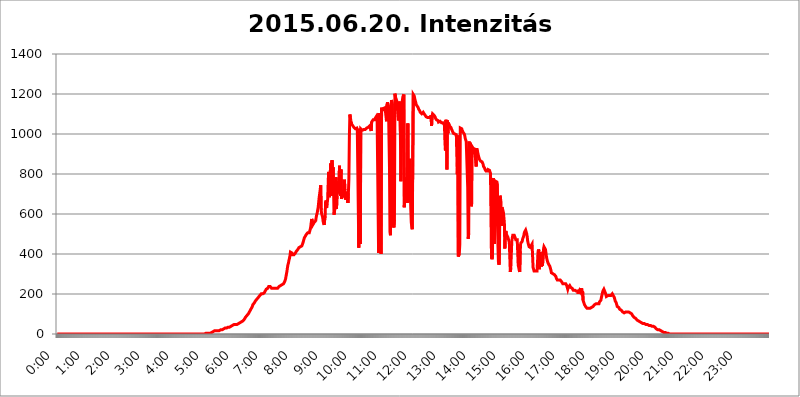
| Category | 2015.06.20. Intenzitás [W/m^2] |
|---|---|
| 0.0 | 0 |
| 0.0006944444444444445 | 0 |
| 0.001388888888888889 | 0 |
| 0.0020833333333333333 | 0 |
| 0.002777777777777778 | 0 |
| 0.003472222222222222 | 0 |
| 0.004166666666666667 | 0 |
| 0.004861111111111111 | 0 |
| 0.005555555555555556 | 0 |
| 0.0062499999999999995 | 0 |
| 0.006944444444444444 | 0 |
| 0.007638888888888889 | 0 |
| 0.008333333333333333 | 0 |
| 0.009027777777777779 | 0 |
| 0.009722222222222222 | 0 |
| 0.010416666666666666 | 0 |
| 0.011111111111111112 | 0 |
| 0.011805555555555555 | 0 |
| 0.012499999999999999 | 0 |
| 0.013194444444444444 | 0 |
| 0.013888888888888888 | 0 |
| 0.014583333333333332 | 0 |
| 0.015277777777777777 | 0 |
| 0.015972222222222224 | 0 |
| 0.016666666666666666 | 0 |
| 0.017361111111111112 | 0 |
| 0.018055555555555557 | 0 |
| 0.01875 | 0 |
| 0.019444444444444445 | 0 |
| 0.02013888888888889 | 0 |
| 0.020833333333333332 | 0 |
| 0.02152777777777778 | 0 |
| 0.022222222222222223 | 0 |
| 0.02291666666666667 | 0 |
| 0.02361111111111111 | 0 |
| 0.024305555555555556 | 0 |
| 0.024999999999999998 | 0 |
| 0.025694444444444447 | 0 |
| 0.02638888888888889 | 0 |
| 0.027083333333333334 | 0 |
| 0.027777777777777776 | 0 |
| 0.02847222222222222 | 0 |
| 0.029166666666666664 | 0 |
| 0.029861111111111113 | 0 |
| 0.030555555555555555 | 0 |
| 0.03125 | 0 |
| 0.03194444444444445 | 0 |
| 0.03263888888888889 | 0 |
| 0.03333333333333333 | 0 |
| 0.034027777777777775 | 0 |
| 0.034722222222222224 | 0 |
| 0.035416666666666666 | 0 |
| 0.036111111111111115 | 0 |
| 0.03680555555555556 | 0 |
| 0.0375 | 0 |
| 0.03819444444444444 | 0 |
| 0.03888888888888889 | 0 |
| 0.03958333333333333 | 0 |
| 0.04027777777777778 | 0 |
| 0.04097222222222222 | 0 |
| 0.041666666666666664 | 0 |
| 0.042361111111111106 | 0 |
| 0.04305555555555556 | 0 |
| 0.043750000000000004 | 0 |
| 0.044444444444444446 | 0 |
| 0.04513888888888889 | 0 |
| 0.04583333333333334 | 0 |
| 0.04652777777777778 | 0 |
| 0.04722222222222222 | 0 |
| 0.04791666666666666 | 0 |
| 0.04861111111111111 | 0 |
| 0.049305555555555554 | 0 |
| 0.049999999999999996 | 0 |
| 0.05069444444444445 | 0 |
| 0.051388888888888894 | 0 |
| 0.052083333333333336 | 0 |
| 0.05277777777777778 | 0 |
| 0.05347222222222222 | 0 |
| 0.05416666666666667 | 0 |
| 0.05486111111111111 | 0 |
| 0.05555555555555555 | 0 |
| 0.05625 | 0 |
| 0.05694444444444444 | 0 |
| 0.057638888888888885 | 0 |
| 0.05833333333333333 | 0 |
| 0.05902777777777778 | 0 |
| 0.059722222222222225 | 0 |
| 0.06041666666666667 | 0 |
| 0.061111111111111116 | 0 |
| 0.06180555555555556 | 0 |
| 0.0625 | 0 |
| 0.06319444444444444 | 0 |
| 0.06388888888888888 | 0 |
| 0.06458333333333334 | 0 |
| 0.06527777777777778 | 0 |
| 0.06597222222222222 | 0 |
| 0.06666666666666667 | 0 |
| 0.06736111111111111 | 0 |
| 0.06805555555555555 | 0 |
| 0.06874999999999999 | 0 |
| 0.06944444444444443 | 0 |
| 0.07013888888888889 | 0 |
| 0.07083333333333333 | 0 |
| 0.07152777777777779 | 0 |
| 0.07222222222222223 | 0 |
| 0.07291666666666667 | 0 |
| 0.07361111111111111 | 0 |
| 0.07430555555555556 | 0 |
| 0.075 | 0 |
| 0.07569444444444444 | 0 |
| 0.0763888888888889 | 0 |
| 0.07708333333333334 | 0 |
| 0.07777777777777778 | 0 |
| 0.07847222222222222 | 0 |
| 0.07916666666666666 | 0 |
| 0.0798611111111111 | 0 |
| 0.08055555555555556 | 0 |
| 0.08125 | 0 |
| 0.08194444444444444 | 0 |
| 0.08263888888888889 | 0 |
| 0.08333333333333333 | 0 |
| 0.08402777777777777 | 0 |
| 0.08472222222222221 | 0 |
| 0.08541666666666665 | 0 |
| 0.08611111111111112 | 0 |
| 0.08680555555555557 | 0 |
| 0.08750000000000001 | 0 |
| 0.08819444444444445 | 0 |
| 0.08888888888888889 | 0 |
| 0.08958333333333333 | 0 |
| 0.09027777777777778 | 0 |
| 0.09097222222222222 | 0 |
| 0.09166666666666667 | 0 |
| 0.09236111111111112 | 0 |
| 0.09305555555555556 | 0 |
| 0.09375 | 0 |
| 0.09444444444444444 | 0 |
| 0.09513888888888888 | 0 |
| 0.09583333333333333 | 0 |
| 0.09652777777777777 | 0 |
| 0.09722222222222222 | 0 |
| 0.09791666666666667 | 0 |
| 0.09861111111111111 | 0 |
| 0.09930555555555555 | 0 |
| 0.09999999999999999 | 0 |
| 0.10069444444444443 | 0 |
| 0.1013888888888889 | 0 |
| 0.10208333333333335 | 0 |
| 0.10277777777777779 | 0 |
| 0.10347222222222223 | 0 |
| 0.10416666666666667 | 0 |
| 0.10486111111111111 | 0 |
| 0.10555555555555556 | 0 |
| 0.10625 | 0 |
| 0.10694444444444444 | 0 |
| 0.1076388888888889 | 0 |
| 0.10833333333333334 | 0 |
| 0.10902777777777778 | 0 |
| 0.10972222222222222 | 0 |
| 0.1111111111111111 | 0 |
| 0.11180555555555556 | 0 |
| 0.11180555555555556 | 0 |
| 0.1125 | 0 |
| 0.11319444444444444 | 0 |
| 0.11388888888888889 | 0 |
| 0.11458333333333333 | 0 |
| 0.11527777777777777 | 0 |
| 0.11597222222222221 | 0 |
| 0.11666666666666665 | 0 |
| 0.1173611111111111 | 0 |
| 0.11805555555555557 | 0 |
| 0.11944444444444445 | 0 |
| 0.12013888888888889 | 0 |
| 0.12083333333333333 | 0 |
| 0.12152777777777778 | 0 |
| 0.12222222222222223 | 0 |
| 0.12291666666666667 | 0 |
| 0.12291666666666667 | 0 |
| 0.12361111111111112 | 0 |
| 0.12430555555555556 | 0 |
| 0.125 | 0 |
| 0.12569444444444444 | 0 |
| 0.12638888888888888 | 0 |
| 0.12708333333333333 | 0 |
| 0.16875 | 0 |
| 0.12847222222222224 | 0 |
| 0.12916666666666668 | 0 |
| 0.12986111111111112 | 0 |
| 0.13055555555555556 | 0 |
| 0.13125 | 0 |
| 0.13194444444444445 | 0 |
| 0.1326388888888889 | 0 |
| 0.13333333333333333 | 0 |
| 0.13402777777777777 | 0 |
| 0.13402777777777777 | 0 |
| 0.13472222222222222 | 0 |
| 0.13541666666666666 | 0 |
| 0.1361111111111111 | 0 |
| 0.13749999999999998 | 0 |
| 0.13819444444444443 | 0 |
| 0.1388888888888889 | 0 |
| 0.13958333333333334 | 0 |
| 0.14027777777777778 | 0 |
| 0.14097222222222222 | 0 |
| 0.14166666666666666 | 0 |
| 0.1423611111111111 | 0 |
| 0.14305555555555557 | 0 |
| 0.14375000000000002 | 0 |
| 0.14444444444444446 | 0 |
| 0.1451388888888889 | 0 |
| 0.1451388888888889 | 0 |
| 0.14652777777777778 | 0 |
| 0.14722222222222223 | 0 |
| 0.14791666666666667 | 0 |
| 0.1486111111111111 | 0 |
| 0.14930555555555555 | 0 |
| 0.15 | 0 |
| 0.15069444444444444 | 0 |
| 0.15138888888888888 | 0 |
| 0.15208333333333332 | 0 |
| 0.15277777777777776 | 0 |
| 0.15347222222222223 | 0 |
| 0.15416666666666667 | 0 |
| 0.15486111111111112 | 0 |
| 0.15555555555555556 | 0 |
| 0.15625 | 0 |
| 0.15694444444444444 | 0 |
| 0.15763888888888888 | 0 |
| 0.15833333333333333 | 0 |
| 0.15902777777777777 | 0 |
| 0.15972222222222224 | 0 |
| 0.16041666666666668 | 0 |
| 0.16111111111111112 | 0 |
| 0.16180555555555556 | 0 |
| 0.1625 | 0 |
| 0.16319444444444445 | 0 |
| 0.1638888888888889 | 0 |
| 0.16458333333333333 | 0 |
| 0.16527777777777777 | 0 |
| 0.16597222222222222 | 0 |
| 0.16666666666666666 | 0 |
| 0.1673611111111111 | 0 |
| 0.16805555555555554 | 0 |
| 0.16874999999999998 | 0 |
| 0.16944444444444443 | 0 |
| 0.17013888888888887 | 0 |
| 0.1708333333333333 | 0 |
| 0.17152777777777775 | 0 |
| 0.17222222222222225 | 0 |
| 0.1729166666666667 | 0 |
| 0.17361111111111113 | 0 |
| 0.17430555555555557 | 0 |
| 0.17500000000000002 | 0 |
| 0.17569444444444446 | 0 |
| 0.1763888888888889 | 0 |
| 0.17708333333333334 | 0 |
| 0.17777777777777778 | 0 |
| 0.17847222222222223 | 0 |
| 0.17916666666666667 | 0 |
| 0.1798611111111111 | 0 |
| 0.18055555555555555 | 0 |
| 0.18125 | 0 |
| 0.18194444444444444 | 0 |
| 0.1826388888888889 | 0 |
| 0.18333333333333335 | 0 |
| 0.1840277777777778 | 0 |
| 0.18472222222222223 | 0 |
| 0.18541666666666667 | 0 |
| 0.18611111111111112 | 0 |
| 0.18680555555555556 | 0 |
| 0.1875 | 0 |
| 0.18819444444444444 | 0 |
| 0.18888888888888888 | 0 |
| 0.18958333333333333 | 0 |
| 0.19027777777777777 | 0 |
| 0.1909722222222222 | 0 |
| 0.19166666666666665 | 0 |
| 0.19236111111111112 | 0 |
| 0.19305555555555554 | 0 |
| 0.19375 | 0 |
| 0.19444444444444445 | 0 |
| 0.1951388888888889 | 0 |
| 0.19583333333333333 | 0 |
| 0.19652777777777777 | 0 |
| 0.19722222222222222 | 0 |
| 0.19791666666666666 | 0 |
| 0.1986111111111111 | 0 |
| 0.19930555555555554 | 0 |
| 0.19999999999999998 | 0 |
| 0.20069444444444443 | 0 |
| 0.20138888888888887 | 0 |
| 0.2020833333333333 | 0 |
| 0.2027777777777778 | 0 |
| 0.2034722222222222 | 0 |
| 0.2041666666666667 | 0 |
| 0.20486111111111113 | 0 |
| 0.20555555555555557 | 0 |
| 0.20625000000000002 | 0 |
| 0.20694444444444446 | 0 |
| 0.2076388888888889 | 0 |
| 0.20833333333333334 | 3.525 |
| 0.20902777777777778 | 0 |
| 0.20972222222222223 | 3.525 |
| 0.21041666666666667 | 3.525 |
| 0.2111111111111111 | 3.525 |
| 0.21180555555555555 | 3.525 |
| 0.2125 | 3.525 |
| 0.21319444444444444 | 3.525 |
| 0.2138888888888889 | 3.525 |
| 0.21458333333333335 | 3.525 |
| 0.2152777777777778 | 7.887 |
| 0.21597222222222223 | 7.887 |
| 0.21666666666666667 | 7.887 |
| 0.21736111111111112 | 12.257 |
| 0.21805555555555556 | 12.257 |
| 0.21875 | 12.257 |
| 0.21944444444444444 | 12.257 |
| 0.22013888888888888 | 16.636 |
| 0.22083333333333333 | 16.636 |
| 0.22152777777777777 | 16.636 |
| 0.2222222222222222 | 16.636 |
| 0.22291666666666665 | 16.636 |
| 0.2236111111111111 | 16.636 |
| 0.22430555555555556 | 16.636 |
| 0.225 | 16.636 |
| 0.22569444444444445 | 16.636 |
| 0.2263888888888889 | 16.636 |
| 0.22708333333333333 | 16.636 |
| 0.22777777777777777 | 21.024 |
| 0.22847222222222222 | 21.024 |
| 0.22916666666666666 | 21.024 |
| 0.2298611111111111 | 21.024 |
| 0.23055555555555554 | 21.024 |
| 0.23124999999999998 | 21.024 |
| 0.23194444444444443 | 25.419 |
| 0.23263888888888887 | 25.419 |
| 0.2333333333333333 | 25.419 |
| 0.2340277777777778 | 25.419 |
| 0.2347222222222222 | 29.823 |
| 0.2354166666666667 | 29.823 |
| 0.23611111111111113 | 29.823 |
| 0.23680555555555557 | 29.823 |
| 0.23750000000000002 | 29.823 |
| 0.23819444444444446 | 29.823 |
| 0.2388888888888889 | 34.234 |
| 0.23958333333333334 | 34.234 |
| 0.24027777777777778 | 34.234 |
| 0.24097222222222223 | 34.234 |
| 0.24166666666666667 | 34.234 |
| 0.2423611111111111 | 38.653 |
| 0.24305555555555555 | 38.653 |
| 0.24375 | 38.653 |
| 0.24444444444444446 | 38.653 |
| 0.24513888888888888 | 43.079 |
| 0.24583333333333335 | 43.079 |
| 0.2465277777777778 | 43.079 |
| 0.24722222222222223 | 43.079 |
| 0.24791666666666667 | 47.511 |
| 0.24861111111111112 | 47.511 |
| 0.24930555555555556 | 47.511 |
| 0.25 | 47.511 |
| 0.25069444444444444 | 47.511 |
| 0.2513888888888889 | 47.511 |
| 0.2520833333333333 | 47.511 |
| 0.25277777777777777 | 47.511 |
| 0.2534722222222222 | 47.511 |
| 0.25416666666666665 | 51.951 |
| 0.2548611111111111 | 51.951 |
| 0.2555555555555556 | 51.951 |
| 0.25625000000000003 | 56.398 |
| 0.2569444444444445 | 56.398 |
| 0.2576388888888889 | 60.85 |
| 0.25833333333333336 | 60.85 |
| 0.2590277777777778 | 60.85 |
| 0.25972222222222224 | 65.31 |
| 0.2604166666666667 | 65.31 |
| 0.2611111111111111 | 69.775 |
| 0.26180555555555557 | 69.775 |
| 0.2625 | 74.246 |
| 0.26319444444444445 | 78.722 |
| 0.2638888888888889 | 83.205 |
| 0.26458333333333334 | 83.205 |
| 0.2652777777777778 | 87.692 |
| 0.2659722222222222 | 92.184 |
| 0.26666666666666666 | 96.682 |
| 0.2673611111111111 | 96.682 |
| 0.26805555555555555 | 101.184 |
| 0.26875 | 105.69 |
| 0.26944444444444443 | 110.201 |
| 0.2701388888888889 | 114.716 |
| 0.2708333333333333 | 119.235 |
| 0.27152777777777776 | 123.758 |
| 0.2722222222222222 | 128.284 |
| 0.27291666666666664 | 132.814 |
| 0.2736111111111111 | 137.347 |
| 0.2743055555555555 | 146.423 |
| 0.27499999999999997 | 146.423 |
| 0.27569444444444446 | 150.964 |
| 0.27638888888888885 | 155.509 |
| 0.27708333333333335 | 160.056 |
| 0.2777777777777778 | 164.605 |
| 0.27847222222222223 | 164.605 |
| 0.2791666666666667 | 169.156 |
| 0.2798611111111111 | 173.709 |
| 0.28055555555555556 | 173.709 |
| 0.28125 | 178.264 |
| 0.28194444444444444 | 182.82 |
| 0.2826388888888889 | 182.82 |
| 0.2833333333333333 | 187.378 |
| 0.28402777777777777 | 191.937 |
| 0.2847222222222222 | 196.497 |
| 0.28541666666666665 | 196.497 |
| 0.28611111111111115 | 201.058 |
| 0.28680555555555554 | 201.058 |
| 0.28750000000000003 | 201.058 |
| 0.2881944444444445 | 201.058 |
| 0.2888888888888889 | 205.62 |
| 0.28958333333333336 | 205.62 |
| 0.2902777777777778 | 205.62 |
| 0.29097222222222224 | 210.182 |
| 0.2916666666666667 | 214.746 |
| 0.2923611111111111 | 219.309 |
| 0.29305555555555557 | 223.873 |
| 0.29375 | 223.873 |
| 0.29444444444444445 | 228.436 |
| 0.2951388888888889 | 228.436 |
| 0.29583333333333334 | 233 |
| 0.2965277777777778 | 237.564 |
| 0.2972222222222222 | 237.564 |
| 0.29791666666666666 | 237.564 |
| 0.2986111111111111 | 237.564 |
| 0.29930555555555555 | 233 |
| 0.3 | 233 |
| 0.30069444444444443 | 228.436 |
| 0.3013888888888889 | 228.436 |
| 0.3020833333333333 | 228.436 |
| 0.30277777777777776 | 228.436 |
| 0.3034722222222222 | 228.436 |
| 0.30416666666666664 | 228.436 |
| 0.3048611111111111 | 228.436 |
| 0.3055555555555555 | 228.436 |
| 0.30624999999999997 | 228.436 |
| 0.3069444444444444 | 228.436 |
| 0.3076388888888889 | 228.436 |
| 0.30833333333333335 | 228.436 |
| 0.3090277777777778 | 228.436 |
| 0.30972222222222223 | 233 |
| 0.3104166666666667 | 233 |
| 0.3111111111111111 | 237.564 |
| 0.31180555555555556 | 242.127 |
| 0.3125 | 242.127 |
| 0.31319444444444444 | 242.127 |
| 0.3138888888888889 | 246.689 |
| 0.3145833333333333 | 246.689 |
| 0.31527777777777777 | 246.689 |
| 0.3159722222222222 | 246.689 |
| 0.31666666666666665 | 246.689 |
| 0.31736111111111115 | 251.251 |
| 0.31805555555555554 | 251.251 |
| 0.31875000000000003 | 260.373 |
| 0.3194444444444445 | 264.932 |
| 0.3201388888888889 | 274.047 |
| 0.32083333333333336 | 287.709 |
| 0.3215277777777778 | 301.354 |
| 0.32222222222222224 | 314.98 |
| 0.3229166666666667 | 333.113 |
| 0.3236111111111111 | 346.682 |
| 0.32430555555555557 | 355.712 |
| 0.325 | 369.23 |
| 0.32569444444444445 | 378.224 |
| 0.3263888888888889 | 391.685 |
| 0.32708333333333334 | 409.574 |
| 0.3277777777777778 | 409.574 |
| 0.3284722222222222 | 414.035 |
| 0.32916666666666666 | 405.108 |
| 0.3298611111111111 | 396.164 |
| 0.33055555555555555 | 396.164 |
| 0.33125 | 396.164 |
| 0.33194444444444443 | 396.164 |
| 0.3326388888888889 | 396.164 |
| 0.3333333333333333 | 400.638 |
| 0.3340277777777778 | 405.108 |
| 0.3347222222222222 | 409.574 |
| 0.3354166666666667 | 414.035 |
| 0.3361111111111111 | 418.492 |
| 0.3368055555555556 | 418.492 |
| 0.33749999999999997 | 422.943 |
| 0.33819444444444446 | 427.39 |
| 0.33888888888888885 | 431.833 |
| 0.33958333333333335 | 431.833 |
| 0.34027777777777773 | 431.833 |
| 0.34097222222222223 | 436.27 |
| 0.3416666666666666 | 440.702 |
| 0.3423611111111111 | 440.702 |
| 0.3430555555555555 | 440.702 |
| 0.34375 | 445.129 |
| 0.3444444444444445 | 453.968 |
| 0.3451388888888889 | 462.786 |
| 0.3458333333333334 | 471.582 |
| 0.34652777777777777 | 480.356 |
| 0.34722222222222227 | 484.735 |
| 0.34791666666666665 | 489.108 |
| 0.34861111111111115 | 493.475 |
| 0.34930555555555554 | 497.836 |
| 0.35000000000000003 | 502.192 |
| 0.3506944444444444 | 502.192 |
| 0.3513888888888889 | 506.542 |
| 0.3520833333333333 | 510.885 |
| 0.3527777777777778 | 506.542 |
| 0.3534722222222222 | 506.542 |
| 0.3541666666666667 | 515.223 |
| 0.3548611111111111 | 523.88 |
| 0.35555555555555557 | 536.82 |
| 0.35625 | 558.261 |
| 0.35694444444444445 | 575.299 |
| 0.3576388888888889 | 566.793 |
| 0.35833333333333334 | 545.416 |
| 0.3590277777777778 | 541.121 |
| 0.3597222222222222 | 549.704 |
| 0.36041666666666666 | 558.261 |
| 0.3611111111111111 | 553.986 |
| 0.36180555555555555 | 553.986 |
| 0.3625 | 566.793 |
| 0.36319444444444443 | 583.779 |
| 0.3638888888888889 | 596.45 |
| 0.3645833333333333 | 604.864 |
| 0.3652777777777778 | 604.864 |
| 0.3659722222222222 | 634.105 |
| 0.3666666666666667 | 658.909 |
| 0.3673611111111111 | 683.473 |
| 0.3680555555555556 | 687.544 |
| 0.36874999999999997 | 719.877 |
| 0.36944444444444446 | 743.859 |
| 0.37013888888888885 | 621.613 |
| 0.37083333333333335 | 600.661 |
| 0.37152777777777773 | 600.661 |
| 0.37222222222222223 | 583.779 |
| 0.3729166666666666 | 562.53 |
| 0.3736111111111111 | 553.986 |
| 0.3743055555555555 | 545.416 |
| 0.375 | 549.704 |
| 0.3756944444444445 | 592.233 |
| 0.3763888888888889 | 658.909 |
| 0.3770833333333334 | 667.123 |
| 0.37777777777777777 | 629.948 |
| 0.37847222222222227 | 654.791 |
| 0.37916666666666665 | 667.123 |
| 0.37986111111111115 | 671.22 |
| 0.38055555555555554 | 810.641 |
| 0.38125000000000003 | 739.877 |
| 0.3819444444444444 | 683.473 |
| 0.3826388888888889 | 763.674 |
| 0.3833333333333333 | 853.029 |
| 0.3840277777777778 | 845.365 |
| 0.3847222222222222 | 691.608 |
| 0.3854166666666667 | 868.305 |
| 0.3861111111111111 | 775.492 |
| 0.38680555555555557 | 833.834 |
| 0.3875 | 735.89 |
| 0.38819444444444445 | 596.45 |
| 0.3888888888888889 | 592.233 |
| 0.38958333333333334 | 634.105 |
| 0.3902777777777778 | 675.311 |
| 0.3909722222222222 | 783.342 |
| 0.39166666666666666 | 625.784 |
| 0.3923611111111111 | 691.608 |
| 0.39305555555555555 | 695.666 |
| 0.39375 | 719.877 |
| 0.39444444444444443 | 763.674 |
| 0.3951388888888889 | 715.858 |
| 0.3958333333333333 | 841.526 |
| 0.3965277777777778 | 727.896 |
| 0.3972222222222222 | 691.608 |
| 0.3979166666666667 | 822.26 |
| 0.3986111111111111 | 675.311 |
| 0.3993055555555556 | 691.608 |
| 0.39999999999999997 | 711.832 |
| 0.40069444444444446 | 719.877 |
| 0.40138888888888885 | 683.473 |
| 0.40208333333333335 | 683.473 |
| 0.40277777777777773 | 771.559 |
| 0.40347222222222223 | 719.877 |
| 0.4041666666666666 | 671.22 |
| 0.4048611111111111 | 679.395 |
| 0.4055555555555555 | 679.395 |
| 0.40625 | 699.717 |
| 0.4069444444444445 | 711.832 |
| 0.4076388888888889 | 654.791 |
| 0.4083333333333334 | 703.762 |
| 0.40902777777777777 | 775.492 |
| 0.40972222222222227 | 988.714 |
| 0.41041666666666665 | 1097.437 |
| 0.41111111111111115 | 1082.324 |
| 0.41180555555555554 | 1067.267 |
| 0.41250000000000003 | 1056.004 |
| 0.4131944444444444 | 1048.508 |
| 0.4138888888888889 | 1044.762 |
| 0.4145833333333333 | 1041.019 |
| 0.4152777777777778 | 1037.277 |
| 0.4159722222222222 | 1033.537 |
| 0.4166666666666667 | 1029.798 |
| 0.4173611111111111 | 1029.798 |
| 0.41805555555555557 | 1026.06 |
| 0.41875 | 1026.06 |
| 0.41944444444444445 | 1026.06 |
| 0.4201388888888889 | 1029.798 |
| 0.42083333333333334 | 1022.323 |
| 0.4215277777777778 | 1018.587 |
| 0.4222222222222222 | 1026.06 |
| 0.42291666666666666 | 431.833 |
| 0.4236111111111111 | 1026.06 |
| 0.42430555555555555 | 1011.118 |
| 0.425 | 449.551 |
| 0.42569444444444443 | 1026.06 |
| 0.4263888888888889 | 1022.323 |
| 0.4270833333333333 | 1022.323 |
| 0.4277777777777778 | 1018.587 |
| 0.4284722222222222 | 1022.323 |
| 0.4291666666666667 | 1022.323 |
| 0.4298611111111111 | 1022.323 |
| 0.4305555555555556 | 1022.323 |
| 0.43124999999999997 | 1026.06 |
| 0.43194444444444446 | 1022.323 |
| 0.43263888888888885 | 1026.06 |
| 0.43333333333333335 | 1026.06 |
| 0.43402777777777773 | 1029.798 |
| 0.43472222222222223 | 1033.537 |
| 0.4354166666666666 | 1029.798 |
| 0.4361111111111111 | 1033.537 |
| 0.4368055555555555 | 1033.537 |
| 0.4375 | 1029.798 |
| 0.4381944444444445 | 1041.019 |
| 0.4388888888888889 | 1037.277 |
| 0.4395833333333334 | 1044.762 |
| 0.44027777777777777 | 1014.852 |
| 0.44097222222222227 | 1059.756 |
| 0.44166666666666665 | 1059.756 |
| 0.44236111111111115 | 1059.756 |
| 0.44305555555555554 | 1071.027 |
| 0.44375000000000003 | 1074.789 |
| 0.4444444444444444 | 1074.789 |
| 0.4451388888888889 | 1071.027 |
| 0.4458333333333333 | 1078.555 |
| 0.4465277777777778 | 1078.555 |
| 0.4472222222222222 | 1078.555 |
| 0.4479166666666667 | 1089.873 |
| 0.4486111111111111 | 1082.324 |
| 0.44930555555555557 | 1078.555 |
| 0.45 | 1082.324 |
| 0.45069444444444445 | 405.108 |
| 0.4513888888888889 | 1105.019 |
| 0.45208333333333334 | 1101.226 |
| 0.4527777777777778 | 1101.226 |
| 0.4534722222222222 | 658.909 |
| 0.45416666666666666 | 400.638 |
| 0.4548611111111111 | 1131.708 |
| 0.45555555555555555 | 1116.426 |
| 0.45625 | 1116.426 |
| 0.45694444444444443 | 1116.426 |
| 0.4576388888888889 | 1127.879 |
| 0.4583333333333333 | 1131.708 |
| 0.4590277777777778 | 1131.708 |
| 0.4597222222222222 | 1131.708 |
| 0.4604166666666667 | 1127.879 |
| 0.4611111111111111 | 1127.879 |
| 0.4618055555555556 | 1063.51 |
| 0.46249999999999997 | 1147.086 |
| 0.46319444444444446 | 1158.689 |
| 0.46388888888888885 | 1154.814 |
| 0.46458333333333335 | 1135.543 |
| 0.46527777777777773 | 1139.384 |
| 0.46597222222222223 | 833.834 |
| 0.4666666666666666 | 510.885 |
| 0.4673611111111111 | 493.475 |
| 0.4680555555555555 | 1018.587 |
| 0.46875 | 1170.358 |
| 0.4694444444444445 | 1170.358 |
| 0.4701388888888889 | 1143.232 |
| 0.4708333333333334 | 553.986 |
| 0.47152777777777777 | 541.121 |
| 0.47222222222222227 | 532.513 |
| 0.47291666666666665 | 571.049 |
| 0.47361111111111115 | 1201.843 |
| 0.47430555555555554 | 1186.03 |
| 0.47500000000000003 | 1182.099 |
| 0.4756944444444444 | 1170.358 |
| 0.4763888888888889 | 1162.571 |
| 0.4770833333333333 | 1162.571 |
| 0.4777777777777778 | 1158.689 |
| 0.4784722222222222 | 1067.267 |
| 0.4791666666666667 | 1078.555 |
| 0.4798611111111111 | 1154.814 |
| 0.48055555555555557 | 1162.571 |
| 0.48125 | 1011.118 |
| 0.48194444444444445 | 763.674 |
| 0.4826388888888889 | 940.082 |
| 0.48333333333333334 | 928.819 |
| 0.4840277777777778 | 1166.46 |
| 0.4847222222222222 | 1186.03 |
| 0.48541666666666666 | 1186.03 |
| 0.4861111111111111 | 1197.876 |
| 0.48680555555555555 | 634.105 |
| 0.4875 | 755.766 |
| 0.48819444444444443 | 679.395 |
| 0.4888888888888889 | 691.608 |
| 0.4895833333333333 | 751.803 |
| 0.4902777777777778 | 783.342 |
| 0.4909722222222222 | 654.791 |
| 0.4916666666666667 | 1052.255 |
| 0.4923611111111111 | 675.311 |
| 0.4930555555555556 | 658.909 |
| 0.49374999999999997 | 715.858 |
| 0.49444444444444446 | 875.918 |
| 0.49513888888888885 | 735.89 |
| 0.49583333333333335 | 625.784 |
| 0.49652777777777773 | 558.261 |
| 0.49722222222222223 | 536.82 |
| 0.4979166666666666 | 523.88 |
| 0.4986111111111111 | 519.555 |
| 0.4993055555555555 | 1197.876 |
| 0.5 | 1201.843 |
| 0.5006944444444444 | 1189.969 |
| 0.5013888888888889 | 1178.177 |
| 0.5020833333333333 | 1166.46 |
| 0.5027777777777778 | 1158.689 |
| 0.5034722222222222 | 1147.086 |
| 0.5041666666666667 | 1143.232 |
| 0.5048611111111111 | 1139.384 |
| 0.5055555555555555 | 1135.543 |
| 0.50625 | 1131.708 |
| 0.5069444444444444 | 1124.056 |
| 0.5076388888888889 | 1120.238 |
| 0.5083333333333333 | 1116.426 |
| 0.5090277777777777 | 1108.816 |
| 0.5097222222222222 | 1108.816 |
| 0.5104166666666666 | 1105.019 |
| 0.5111111111111112 | 1101.226 |
| 0.5118055555555555 | 1101.226 |
| 0.5125000000000001 | 1105.019 |
| 0.5131944444444444 | 1108.816 |
| 0.513888888888889 | 1108.816 |
| 0.5145833333333333 | 1101.226 |
| 0.5152777777777778 | 1097.437 |
| 0.5159722222222222 | 1093.653 |
| 0.5166666666666667 | 1089.873 |
| 0.517361111111111 | 1086.097 |
| 0.5180555555555556 | 1086.097 |
| 0.5187499999999999 | 1082.324 |
| 0.5194444444444445 | 1082.324 |
| 0.5201388888888888 | 1086.097 |
| 0.5208333333333334 | 1082.324 |
| 0.5215277777777778 | 1082.324 |
| 0.5222222222222223 | 1082.324 |
| 0.5229166666666667 | 1078.555 |
| 0.5236111111111111 | 1082.324 |
| 0.5243055555555556 | 1093.653 |
| 0.525 | 1041.019 |
| 0.5256944444444445 | 1089.873 |
| 0.5263888888888889 | 1101.226 |
| 0.5270833333333333 | 1101.226 |
| 0.5277777777777778 | 1101.226 |
| 0.5284722222222222 | 1093.653 |
| 0.5291666666666667 | 1089.873 |
| 0.5298611111111111 | 1086.097 |
| 0.5305555555555556 | 1078.555 |
| 0.53125 | 1074.789 |
| 0.5319444444444444 | 1071.027 |
| 0.5326388888888889 | 1067.267 |
| 0.5333333333333333 | 1067.267 |
| 0.5340277777777778 | 1067.267 |
| 0.5347222222222222 | 1059.756 |
| 0.5354166666666667 | 1059.756 |
| 0.5361111111111111 | 1059.756 |
| 0.5368055555555555 | 1063.51 |
| 0.5375 | 1063.51 |
| 0.5381944444444444 | 1059.756 |
| 0.5388888888888889 | 1056.004 |
| 0.5395833333333333 | 1059.756 |
| 0.5402777777777777 | 1052.255 |
| 0.5409722222222222 | 1056.004 |
| 0.5416666666666666 | 1056.004 |
| 0.5423611111111112 | 1052.255 |
| 0.5430555555555555 | 1044.762 |
| 0.5437500000000001 | 958.814 |
| 0.5444444444444444 | 917.534 |
| 0.545138888888889 | 1071.027 |
| 0.5458333333333333 | 1044.762 |
| 0.5465277777777778 | 822.26 |
| 0.5472222222222222 | 1067.267 |
| 0.5479166666666667 | 1003.65 |
| 0.548611111111111 | 1056.004 |
| 0.5493055555555556 | 1052.255 |
| 0.5499999999999999 | 1041.019 |
| 0.5506944444444445 | 1037.277 |
| 0.5513888888888888 | 1037.277 |
| 0.5520833333333334 | 1033.537 |
| 0.5527777777777778 | 1026.06 |
| 0.5534722222222223 | 1022.323 |
| 0.5541666666666667 | 1014.852 |
| 0.5548611111111111 | 1011.118 |
| 0.5555555555555556 | 1003.65 |
| 0.55625 | 1003.65 |
| 0.5569444444444445 | 1003.65 |
| 0.5576388888888889 | 999.916 |
| 0.5583333333333333 | 996.182 |
| 0.5590277777777778 | 996.182 |
| 0.5597222222222222 | 996.182 |
| 0.5604166666666667 | 999.916 |
| 0.5611111111111111 | 798.974 |
| 0.5618055555555556 | 992.448 |
| 0.5625 | 387.202 |
| 0.5631944444444444 | 382.715 |
| 0.5638888888888889 | 400.638 |
| 0.5645833333333333 | 449.551 |
| 0.5652777777777778 | 1029.798 |
| 0.5659722222222222 | 1026.06 |
| 0.5666666666666667 | 1026.06 |
| 0.5673611111111111 | 1026.06 |
| 0.5680555555555555 | 1018.587 |
| 0.56875 | 1018.587 |
| 0.5694444444444444 | 1007.383 |
| 0.5701388888888889 | 1007.383 |
| 0.5708333333333333 | 999.916 |
| 0.5715277777777777 | 992.448 |
| 0.5722222222222222 | 977.508 |
| 0.5729166666666666 | 970.034 |
| 0.5736111111111112 | 962.555 |
| 0.5743055555555555 | 958.814 |
| 0.5750000000000001 | 962.555 |
| 0.5756944444444444 | 731.896 |
| 0.576388888888889 | 475.972 |
| 0.5770833333333333 | 502.192 |
| 0.5777777777777778 | 962.555 |
| 0.5784722222222222 | 675.311 |
| 0.5791666666666667 | 955.071 |
| 0.579861111111111 | 947.58 |
| 0.5805555555555556 | 638.256 |
| 0.5812499999999999 | 650.667 |
| 0.5819444444444445 | 936.33 |
| 0.5826388888888888 | 932.576 |
| 0.5833333333333334 | 928.819 |
| 0.5840277777777778 | 928.819 |
| 0.5847222222222223 | 928.819 |
| 0.5854166666666667 | 925.06 |
| 0.5861111111111111 | 925.06 |
| 0.5868055555555556 | 868.305 |
| 0.5875 | 837.682 |
| 0.5881944444444445 | 928.819 |
| 0.5888888888888889 | 928.819 |
| 0.5895833333333333 | 909.996 |
| 0.5902777777777778 | 898.668 |
| 0.5909722222222222 | 887.309 |
| 0.5916666666666667 | 879.719 |
| 0.5923611111111111 | 872.114 |
| 0.5930555555555556 | 868.305 |
| 0.59375 | 864.493 |
| 0.5944444444444444 | 864.493 |
| 0.5951388888888889 | 868.305 |
| 0.5958333333333333 | 860.676 |
| 0.5965277777777778 | 856.855 |
| 0.5972222222222222 | 849.199 |
| 0.5979166666666667 | 837.682 |
| 0.5986111111111111 | 833.834 |
| 0.5993055555555555 | 829.981 |
| 0.6 | 822.26 |
| 0.6006944444444444 | 818.392 |
| 0.6013888888888889 | 814.519 |
| 0.6020833333333333 | 814.519 |
| 0.6027777777777777 | 814.519 |
| 0.6034722222222222 | 814.519 |
| 0.6041666666666666 | 822.26 |
| 0.6048611111111112 | 826.123 |
| 0.6055555555555555 | 822.26 |
| 0.6062500000000001 | 818.392 |
| 0.6069444444444444 | 810.641 |
| 0.607638888888889 | 802.868 |
| 0.6083333333333333 | 802.868 |
| 0.6090277777777778 | 382.715 |
| 0.6097222222222222 | 373.729 |
| 0.6104166666666667 | 387.202 |
| 0.611111111111111 | 771.559 |
| 0.6118055555555556 | 779.42 |
| 0.6124999999999999 | 759.723 |
| 0.6131944444444445 | 449.551 |
| 0.6138888888888888 | 600.661 |
| 0.6145833333333334 | 763.674 |
| 0.6152777777777778 | 763.674 |
| 0.6159722222222223 | 767.62 |
| 0.6166666666666667 | 759.723 |
| 0.6173611111111111 | 747.834 |
| 0.6180555555555556 | 449.551 |
| 0.61875 | 360.221 |
| 0.6194444444444445 | 346.682 |
| 0.6201388888888889 | 360.221 |
| 0.6208333333333333 | 691.608 |
| 0.6215277777777778 | 683.473 |
| 0.6222222222222222 | 663.019 |
| 0.6229166666666667 | 541.121 |
| 0.6236111111111111 | 634.105 |
| 0.6243055555555556 | 629.948 |
| 0.625 | 617.436 |
| 0.6256944444444444 | 609.062 |
| 0.6263888888888889 | 583.779 |
| 0.6270833333333333 | 558.261 |
| 0.6277777777777778 | 427.39 |
| 0.6284722222222222 | 506.542 |
| 0.6291666666666667 | 515.223 |
| 0.6298611111111111 | 502.192 |
| 0.6305555555555555 | 493.475 |
| 0.63125 | 489.108 |
| 0.6319444444444444 | 484.735 |
| 0.6326388888888889 | 475.972 |
| 0.6333333333333333 | 467.187 |
| 0.6340277777777777 | 458.38 |
| 0.6347222222222222 | 458.38 |
| 0.6354166666666666 | 310.44 |
| 0.6361111111111112 | 328.584 |
| 0.6368055555555555 | 324.052 |
| 0.6375000000000001 | 462.786 |
| 0.6381944444444444 | 480.356 |
| 0.638888888888889 | 493.475 |
| 0.6395833333333333 | 497.836 |
| 0.6402777777777778 | 497.836 |
| 0.6409722222222222 | 493.475 |
| 0.6416666666666667 | 489.108 |
| 0.642361111111111 | 480.356 |
| 0.6430555555555556 | 471.582 |
| 0.6437499999999999 | 471.582 |
| 0.6444444444444445 | 471.582 |
| 0.6451388888888888 | 471.582 |
| 0.6458333333333334 | 471.582 |
| 0.6465277777777778 | 342.162 |
| 0.6472222222222223 | 333.113 |
| 0.6479166666666667 | 319.517 |
| 0.6486111111111111 | 310.44 |
| 0.6493055555555556 | 414.035 |
| 0.65 | 453.968 |
| 0.6506944444444445 | 453.968 |
| 0.6513888888888889 | 458.38 |
| 0.6520833333333333 | 462.786 |
| 0.6527777777777778 | 475.972 |
| 0.6534722222222222 | 480.356 |
| 0.6541666666666667 | 489.108 |
| 0.6548611111111111 | 502.192 |
| 0.6555555555555556 | 510.885 |
| 0.65625 | 515.223 |
| 0.6569444444444444 | 519.555 |
| 0.6576388888888889 | 515.223 |
| 0.6583333333333333 | 502.192 |
| 0.6590277777777778 | 489.108 |
| 0.6597222222222222 | 467.187 |
| 0.6604166666666667 | 453.968 |
| 0.6611111111111111 | 445.129 |
| 0.6618055555555555 | 436.27 |
| 0.6625 | 431.833 |
| 0.6631944444444444 | 431.833 |
| 0.6638888888888889 | 431.833 |
| 0.6645833333333333 | 440.702 |
| 0.6652777777777777 | 445.129 |
| 0.6659722222222222 | 449.551 |
| 0.6666666666666666 | 449.551 |
| 0.6673611111111111 | 333.113 |
| 0.6680555555555556 | 324.052 |
| 0.6687500000000001 | 314.98 |
| 0.6694444444444444 | 314.98 |
| 0.6701388888888888 | 319.517 |
| 0.6708333333333334 | 314.98 |
| 0.6715277777777778 | 314.98 |
| 0.6722222222222222 | 314.98 |
| 0.6729166666666666 | 314.98 |
| 0.6736111111111112 | 314.98 |
| 0.6743055555555556 | 409.574 |
| 0.6749999999999999 | 422.943 |
| 0.6756944444444444 | 414.035 |
| 0.6763888888888889 | 324.052 |
| 0.6770833333333334 | 409.574 |
| 0.6777777777777777 | 369.23 |
| 0.6784722222222223 | 378.224 |
| 0.6791666666666667 | 337.639 |
| 0.6798611111111111 | 378.224 |
| 0.6805555555555555 | 342.162 |
| 0.68125 | 342.162 |
| 0.6819444444444445 | 422.943 |
| 0.6826388888888889 | 436.27 |
| 0.6833333333333332 | 440.702 |
| 0.6840277777777778 | 431.833 |
| 0.6847222222222222 | 422.943 |
| 0.6854166666666667 | 405.108 |
| 0.686111111111111 | 387.202 |
| 0.6868055555555556 | 373.729 |
| 0.6875 | 364.728 |
| 0.6881944444444444 | 355.712 |
| 0.688888888888889 | 351.198 |
| 0.6895833333333333 | 346.682 |
| 0.6902777777777778 | 342.162 |
| 0.6909722222222222 | 337.639 |
| 0.6916666666666668 | 328.584 |
| 0.6923611111111111 | 319.517 |
| 0.6930555555555555 | 305.898 |
| 0.69375 | 305.898 |
| 0.6944444444444445 | 305.898 |
| 0.6951388888888889 | 301.354 |
| 0.6958333333333333 | 301.354 |
| 0.6965277777777777 | 301.354 |
| 0.6972222222222223 | 296.808 |
| 0.6979166666666666 | 292.259 |
| 0.6986111111111111 | 292.259 |
| 0.6993055555555556 | 287.709 |
| 0.7000000000000001 | 278.603 |
| 0.7006944444444444 | 274.047 |
| 0.7013888888888888 | 269.49 |
| 0.7020833333333334 | 269.49 |
| 0.7027777777777778 | 269.49 |
| 0.7034722222222222 | 269.49 |
| 0.7041666666666666 | 274.047 |
| 0.7048611111111112 | 269.49 |
| 0.7055555555555556 | 269.49 |
| 0.7062499999999999 | 264.932 |
| 0.7069444444444444 | 264.932 |
| 0.7076388888888889 | 260.373 |
| 0.7083333333333334 | 255.813 |
| 0.7090277777777777 | 251.251 |
| 0.7097222222222223 | 251.251 |
| 0.7104166666666667 | 251.251 |
| 0.7111111111111111 | 251.251 |
| 0.7118055555555555 | 251.251 |
| 0.7125 | 251.251 |
| 0.7131944444444445 | 251.251 |
| 0.7138888888888889 | 246.689 |
| 0.7145833333333332 | 242.127 |
| 0.7152777777777778 | 242.127 |
| 0.7159722222222222 | 223.873 |
| 0.7166666666666667 | 233 |
| 0.717361111111111 | 237.564 |
| 0.7180555555555556 | 237.564 |
| 0.71875 | 242.127 |
| 0.7194444444444444 | 237.564 |
| 0.720138888888889 | 233 |
| 0.7208333333333333 | 233 |
| 0.7215277777777778 | 233 |
| 0.7222222222222222 | 228.436 |
| 0.7229166666666668 | 223.873 |
| 0.7236111111111111 | 219.309 |
| 0.7243055555555555 | 219.309 |
| 0.725 | 219.309 |
| 0.7256944444444445 | 219.309 |
| 0.7263888888888889 | 219.309 |
| 0.7270833333333333 | 214.746 |
| 0.7277777777777777 | 214.746 |
| 0.7284722222222223 | 214.746 |
| 0.7291666666666666 | 214.746 |
| 0.7298611111111111 | 214.746 |
| 0.7305555555555556 | 201.058 |
| 0.7312500000000001 | 210.182 |
| 0.7319444444444444 | 214.746 |
| 0.7326388888888888 | 219.309 |
| 0.7333333333333334 | 219.309 |
| 0.7340277777777778 | 210.182 |
| 0.7347222222222222 | 219.309 |
| 0.7354166666666666 | 228.436 |
| 0.7361111111111112 | 205.62 |
| 0.7368055555555556 | 214.746 |
| 0.7374999999999999 | 169.156 |
| 0.7381944444444444 | 160.056 |
| 0.7388888888888889 | 155.509 |
| 0.7395833333333334 | 146.423 |
| 0.7402777777777777 | 141.884 |
| 0.7409722222222223 | 137.347 |
| 0.7416666666666667 | 132.814 |
| 0.7423611111111111 | 132.814 |
| 0.7430555555555555 | 128.284 |
| 0.74375 | 128.284 |
| 0.7444444444444445 | 128.284 |
| 0.7451388888888889 | 128.284 |
| 0.7458333333333332 | 128.284 |
| 0.7465277777777778 | 128.284 |
| 0.7472222222222222 | 128.284 |
| 0.7479166666666667 | 128.284 |
| 0.748611111111111 | 128.284 |
| 0.7493055555555556 | 132.814 |
| 0.75 | 132.814 |
| 0.7506944444444444 | 137.347 |
| 0.751388888888889 | 137.347 |
| 0.7520833333333333 | 137.347 |
| 0.7527777777777778 | 141.884 |
| 0.7534722222222222 | 146.423 |
| 0.7541666666666668 | 146.423 |
| 0.7548611111111111 | 150.964 |
| 0.7555555555555555 | 150.964 |
| 0.75625 | 150.964 |
| 0.7569444444444445 | 150.964 |
| 0.7576388888888889 | 150.964 |
| 0.7583333333333333 | 150.964 |
| 0.7590277777777777 | 150.964 |
| 0.7597222222222223 | 150.964 |
| 0.7604166666666666 | 160.056 |
| 0.7611111111111111 | 164.605 |
| 0.7618055555555556 | 164.605 |
| 0.7625000000000001 | 169.156 |
| 0.7631944444444444 | 182.82 |
| 0.7638888888888888 | 182.82 |
| 0.7645833333333334 | 178.264 |
| 0.7652777777777778 | 214.746 |
| 0.7659722222222222 | 219.309 |
| 0.7666666666666666 | 223.873 |
| 0.7673611111111112 | 223.873 |
| 0.7680555555555556 | 228.436 |
| 0.7687499999999999 | 205.62 |
| 0.7694444444444444 | 201.058 |
| 0.7701388888888889 | 187.378 |
| 0.7708333333333334 | 182.82 |
| 0.7715277777777777 | 182.82 |
| 0.7722222222222223 | 191.937 |
| 0.7729166666666667 | 191.937 |
| 0.7736111111111111 | 191.937 |
| 0.7743055555555555 | 191.937 |
| 0.775 | 191.937 |
| 0.7756944444444445 | 191.937 |
| 0.7763888888888889 | 191.937 |
| 0.7770833333333332 | 191.937 |
| 0.7777777777777778 | 196.497 |
| 0.7784722222222222 | 201.058 |
| 0.7791666666666667 | 196.497 |
| 0.779861111111111 | 191.937 |
| 0.7805555555555556 | 187.378 |
| 0.78125 | 182.82 |
| 0.7819444444444444 | 173.709 |
| 0.782638888888889 | 164.605 |
| 0.7833333333333333 | 160.056 |
| 0.7840277777777778 | 155.509 |
| 0.7847222222222222 | 146.423 |
| 0.7854166666666668 | 137.347 |
| 0.7861111111111111 | 137.347 |
| 0.7868055555555555 | 137.347 |
| 0.7875 | 132.814 |
| 0.7881944444444445 | 128.284 |
| 0.7888888888888889 | 123.758 |
| 0.7895833333333333 | 119.235 |
| 0.7902777777777777 | 119.235 |
| 0.7909722222222223 | 119.235 |
| 0.7916666666666666 | 114.716 |
| 0.7923611111111111 | 114.716 |
| 0.7930555555555556 | 110.201 |
| 0.7937500000000001 | 110.201 |
| 0.7944444444444444 | 105.69 |
| 0.7951388888888888 | 105.69 |
| 0.7958333333333334 | 105.69 |
| 0.7965277777777778 | 110.201 |
| 0.7972222222222222 | 110.201 |
| 0.7979166666666666 | 110.201 |
| 0.7986111111111112 | 110.201 |
| 0.7993055555555556 | 110.201 |
| 0.7999999999999999 | 105.69 |
| 0.8006944444444444 | 105.69 |
| 0.8013888888888889 | 110.201 |
| 0.8020833333333334 | 110.201 |
| 0.8027777777777777 | 105.69 |
| 0.8034722222222223 | 105.69 |
| 0.8041666666666667 | 105.69 |
| 0.8048611111111111 | 101.184 |
| 0.8055555555555555 | 101.184 |
| 0.80625 | 96.682 |
| 0.8069444444444445 | 92.184 |
| 0.8076388888888889 | 87.692 |
| 0.8083333333333332 | 87.692 |
| 0.8090277777777778 | 83.205 |
| 0.8097222222222222 | 83.205 |
| 0.8104166666666667 | 78.722 |
| 0.811111111111111 | 78.722 |
| 0.8118055555555556 | 74.246 |
| 0.8125 | 74.246 |
| 0.8131944444444444 | 69.775 |
| 0.813888888888889 | 69.775 |
| 0.8145833333333333 | 65.31 |
| 0.8152777777777778 | 65.31 |
| 0.8159722222222222 | 65.31 |
| 0.8166666666666668 | 60.85 |
| 0.8173611111111111 | 60.85 |
| 0.8180555555555555 | 56.398 |
| 0.81875 | 56.398 |
| 0.8194444444444445 | 56.398 |
| 0.8201388888888889 | 56.398 |
| 0.8208333333333333 | 51.951 |
| 0.8215277777777777 | 51.951 |
| 0.8222222222222223 | 51.951 |
| 0.8229166666666666 | 51.951 |
| 0.8236111111111111 | 51.951 |
| 0.8243055555555556 | 51.951 |
| 0.8250000000000001 | 47.511 |
| 0.8256944444444444 | 47.511 |
| 0.8263888888888888 | 47.511 |
| 0.8270833333333334 | 47.511 |
| 0.8277777777777778 | 47.511 |
| 0.8284722222222222 | 47.511 |
| 0.8291666666666666 | 47.511 |
| 0.8298611111111112 | 43.079 |
| 0.8305555555555556 | 43.079 |
| 0.8312499999999999 | 43.079 |
| 0.8319444444444444 | 43.079 |
| 0.8326388888888889 | 43.079 |
| 0.8333333333333334 | 43.079 |
| 0.8340277777777777 | 38.653 |
| 0.8347222222222223 | 38.653 |
| 0.8354166666666667 | 38.653 |
| 0.8361111111111111 | 38.653 |
| 0.8368055555555555 | 34.234 |
| 0.8375 | 34.234 |
| 0.8381944444444445 | 34.234 |
| 0.8388888888888889 | 29.823 |
| 0.8395833333333332 | 29.823 |
| 0.8402777777777778 | 25.419 |
| 0.8409722222222222 | 25.419 |
| 0.8416666666666667 | 25.419 |
| 0.842361111111111 | 21.024 |
| 0.8430555555555556 | 21.024 |
| 0.84375 | 21.024 |
| 0.8444444444444444 | 21.024 |
| 0.845138888888889 | 21.024 |
| 0.8458333333333333 | 16.636 |
| 0.8465277777777778 | 16.636 |
| 0.8472222222222222 | 16.636 |
| 0.8479166666666668 | 16.636 |
| 0.8486111111111111 | 12.257 |
| 0.8493055555555555 | 12.257 |
| 0.85 | 12.257 |
| 0.8506944444444445 | 7.887 |
| 0.8513888888888889 | 7.887 |
| 0.8520833333333333 | 7.887 |
| 0.8527777777777777 | 7.887 |
| 0.8534722222222223 | 3.525 |
| 0.8541666666666666 | 3.525 |
| 0.8548611111111111 | 3.525 |
| 0.8555555555555556 | 3.525 |
| 0.8562500000000001 | 3.525 |
| 0.8569444444444444 | 3.525 |
| 0.8576388888888888 | 3.525 |
| 0.8583333333333334 | 3.525 |
| 0.8590277777777778 | 0 |
| 0.8597222222222222 | 0 |
| 0.8604166666666666 | 0 |
| 0.8611111111111112 | 0 |
| 0.8618055555555556 | 0 |
| 0.8624999999999999 | 0 |
| 0.8631944444444444 | 0 |
| 0.8638888888888889 | 0 |
| 0.8645833333333334 | 0 |
| 0.8652777777777777 | 0 |
| 0.8659722222222223 | 0 |
| 0.8666666666666667 | 0 |
| 0.8673611111111111 | 0 |
| 0.8680555555555555 | 0 |
| 0.86875 | 0 |
| 0.8694444444444445 | 0 |
| 0.8701388888888889 | 0 |
| 0.8708333333333332 | 0 |
| 0.8715277777777778 | 0 |
| 0.8722222222222222 | 0 |
| 0.8729166666666667 | 0 |
| 0.873611111111111 | 0 |
| 0.8743055555555556 | 0 |
| 0.875 | 0 |
| 0.8756944444444444 | 0 |
| 0.876388888888889 | 0 |
| 0.8770833333333333 | 0 |
| 0.8777777777777778 | 0 |
| 0.8784722222222222 | 0 |
| 0.8791666666666668 | 0 |
| 0.8798611111111111 | 0 |
| 0.8805555555555555 | 0 |
| 0.88125 | 0 |
| 0.8819444444444445 | 0 |
| 0.8826388888888889 | 0 |
| 0.8833333333333333 | 0 |
| 0.8840277777777777 | 0 |
| 0.8847222222222223 | 0 |
| 0.8854166666666666 | 0 |
| 0.8861111111111111 | 0 |
| 0.8868055555555556 | 0 |
| 0.8875000000000001 | 0 |
| 0.8881944444444444 | 0 |
| 0.8888888888888888 | 0 |
| 0.8895833333333334 | 0 |
| 0.8902777777777778 | 0 |
| 0.8909722222222222 | 0 |
| 0.8916666666666666 | 0 |
| 0.8923611111111112 | 0 |
| 0.8930555555555556 | 0 |
| 0.8937499999999999 | 0 |
| 0.8944444444444444 | 0 |
| 0.8951388888888889 | 0 |
| 0.8958333333333334 | 0 |
| 0.8965277777777777 | 0 |
| 0.8972222222222223 | 0 |
| 0.8979166666666667 | 0 |
| 0.8986111111111111 | 0 |
| 0.8993055555555555 | 0 |
| 0.9 | 0 |
| 0.9006944444444445 | 0 |
| 0.9013888888888889 | 0 |
| 0.9020833333333332 | 0 |
| 0.9027777777777778 | 0 |
| 0.9034722222222222 | 0 |
| 0.9041666666666667 | 0 |
| 0.904861111111111 | 0 |
| 0.9055555555555556 | 0 |
| 0.90625 | 0 |
| 0.9069444444444444 | 0 |
| 0.907638888888889 | 0 |
| 0.9083333333333333 | 0 |
| 0.9090277777777778 | 0 |
| 0.9097222222222222 | 0 |
| 0.9104166666666668 | 0 |
| 0.9111111111111111 | 0 |
| 0.9118055555555555 | 0 |
| 0.9125 | 0 |
| 0.9131944444444445 | 0 |
| 0.9138888888888889 | 0 |
| 0.9145833333333333 | 0 |
| 0.9152777777777777 | 0 |
| 0.9159722222222223 | 0 |
| 0.9166666666666666 | 0 |
| 0.9173611111111111 | 0 |
| 0.9180555555555556 | 0 |
| 0.9187500000000001 | 0 |
| 0.9194444444444444 | 0 |
| 0.9201388888888888 | 0 |
| 0.9208333333333334 | 0 |
| 0.9215277777777778 | 0 |
| 0.9222222222222222 | 0 |
| 0.9229166666666666 | 0 |
| 0.9236111111111112 | 0 |
| 0.9243055555555556 | 0 |
| 0.9249999999999999 | 0 |
| 0.9256944444444444 | 0 |
| 0.9263888888888889 | 0 |
| 0.9270833333333334 | 0 |
| 0.9277777777777777 | 0 |
| 0.9284722222222223 | 0 |
| 0.9291666666666667 | 0 |
| 0.9298611111111111 | 0 |
| 0.9305555555555555 | 0 |
| 0.93125 | 0 |
| 0.9319444444444445 | 0 |
| 0.9326388888888889 | 0 |
| 0.9333333333333332 | 0 |
| 0.9340277777777778 | 0 |
| 0.9347222222222222 | 0 |
| 0.9354166666666667 | 0 |
| 0.936111111111111 | 0 |
| 0.9368055555555556 | 0 |
| 0.9375 | 0 |
| 0.9381944444444444 | 0 |
| 0.938888888888889 | 0 |
| 0.9395833333333333 | 0 |
| 0.9402777777777778 | 0 |
| 0.9409722222222222 | 0 |
| 0.9416666666666668 | 0 |
| 0.9423611111111111 | 0 |
| 0.9430555555555555 | 0 |
| 0.94375 | 0 |
| 0.9444444444444445 | 0 |
| 0.9451388888888889 | 0 |
| 0.9458333333333333 | 0 |
| 0.9465277777777777 | 0 |
| 0.9472222222222223 | 0 |
| 0.9479166666666666 | 0 |
| 0.9486111111111111 | 0 |
| 0.9493055555555556 | 0 |
| 0.9500000000000001 | 0 |
| 0.9506944444444444 | 0 |
| 0.9513888888888888 | 0 |
| 0.9520833333333334 | 0 |
| 0.9527777777777778 | 0 |
| 0.9534722222222222 | 0 |
| 0.9541666666666666 | 0 |
| 0.9548611111111112 | 0 |
| 0.9555555555555556 | 0 |
| 0.9562499999999999 | 0 |
| 0.9569444444444444 | 0 |
| 0.9576388888888889 | 0 |
| 0.9583333333333334 | 0 |
| 0.9590277777777777 | 0 |
| 0.9597222222222223 | 0 |
| 0.9604166666666667 | 0 |
| 0.9611111111111111 | 0 |
| 0.9618055555555555 | 0 |
| 0.9625 | 0 |
| 0.9631944444444445 | 0 |
| 0.9638888888888889 | 0 |
| 0.9645833333333332 | 0 |
| 0.9652777777777778 | 0 |
| 0.9659722222222222 | 0 |
| 0.9666666666666667 | 0 |
| 0.967361111111111 | 0 |
| 0.9680555555555556 | 0 |
| 0.96875 | 0 |
| 0.9694444444444444 | 0 |
| 0.970138888888889 | 0 |
| 0.9708333333333333 | 0 |
| 0.9715277777777778 | 0 |
| 0.9722222222222222 | 0 |
| 0.9729166666666668 | 0 |
| 0.9736111111111111 | 0 |
| 0.9743055555555555 | 0 |
| 0.975 | 0 |
| 0.9756944444444445 | 0 |
| 0.9763888888888889 | 0 |
| 0.9770833333333333 | 0 |
| 0.9777777777777777 | 0 |
| 0.9784722222222223 | 0 |
| 0.9791666666666666 | 0 |
| 0.9798611111111111 | 0 |
| 0.9805555555555556 | 0 |
| 0.9812500000000001 | 0 |
| 0.9819444444444444 | 0 |
| 0.9826388888888888 | 0 |
| 0.9833333333333334 | 0 |
| 0.9840277777777778 | 0 |
| 0.9847222222222222 | 0 |
| 0.9854166666666666 | 0 |
| 0.9861111111111112 | 0 |
| 0.9868055555555556 | 0 |
| 0.9874999999999999 | 0 |
| 0.9881944444444444 | 0 |
| 0.9888888888888889 | 0 |
| 0.9895833333333334 | 0 |
| 0.9902777777777777 | 0 |
| 0.9909722222222223 | 0 |
| 0.9916666666666667 | 0 |
| 0.9923611111111111 | 0 |
| 0.9930555555555555 | 0 |
| 0.99375 | 0 |
| 0.9944444444444445 | 0 |
| 0.9951388888888889 | 0 |
| 0.9958333333333332 | 0 |
| 0.9965277777777778 | 0 |
| 0.9972222222222222 | 0 |
| 0.9979166666666667 | 0 |
| 0.998611111111111 | 0 |
| 0.9993055555555556 | 0 |